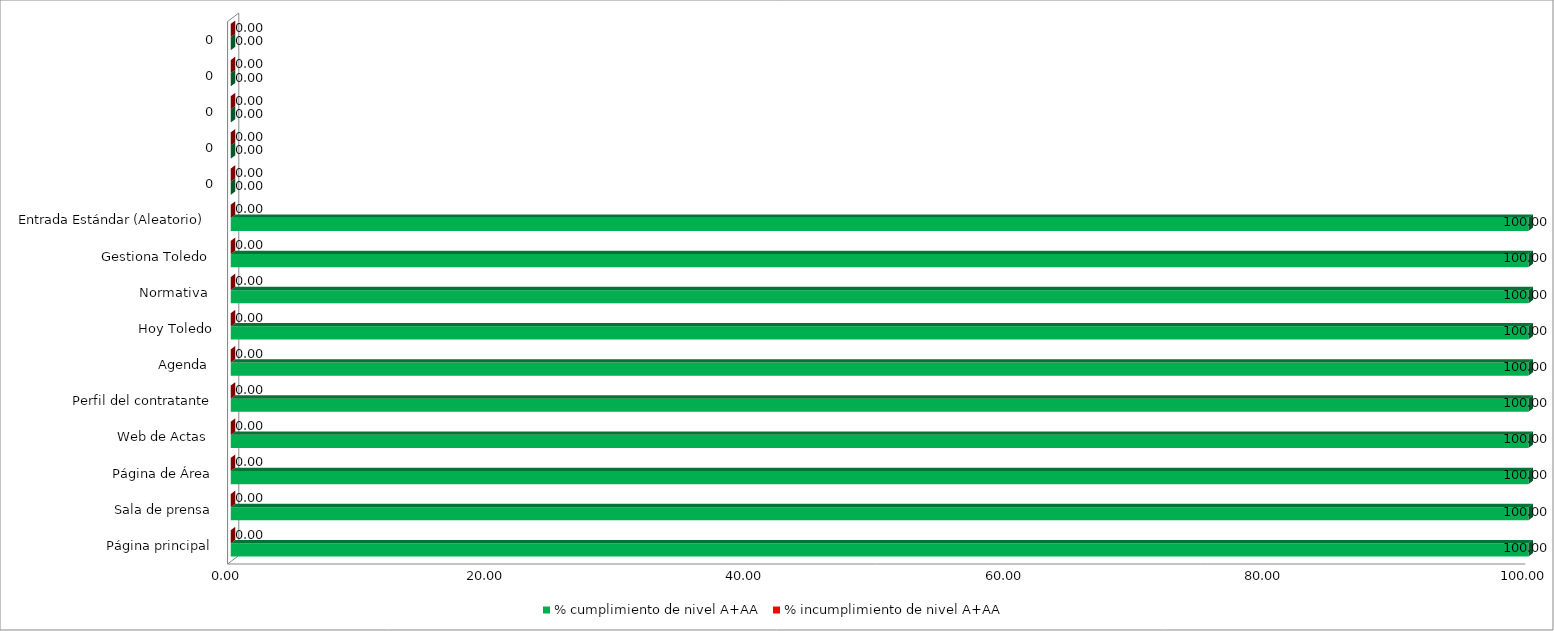
| Category | % cumplimiento de nivel A+AA | % incumplimiento de nivel A+AA |
|---|---|---|
| Página principal | 100 | 0 |
| Sala de prensa | 100 | 0 |
| Página de Área | 100 | 0 |
| Web de Actas  | 100 | 0 |
| Perfil del contratante | 100 | 0 |
| Agenda  | 100 | 0 |
| Hoy Toledo | 100 | 0 |
| Normativa  | 100 | 0 |
| Gestiona Toledo  | 100 | 0 |
| Entrada Estándar (Aleatorio)  | 100 | 0 |
| 0 | 0 | 0 |
| 0 | 0 | 0 |
| 0 | 0 | 0 |
| 0 | 0 | 0 |
| 0 | 0 | 0 |